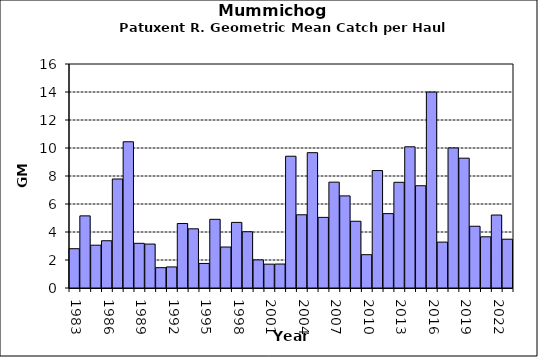
| Category | Series 0 |
|---|---|
| 1983.0 | 2.806 |
| 1984.0 | 5.153 |
| 1985.0 | 3.058 |
| 1986.0 | 3.375 |
| 1987.0 | 7.787 |
| 1988.0 | 10.445 |
| 1989.0 | 3.191 |
| 1990.0 | 3.139 |
| 1991.0 | 1.452 |
| 1992.0 | 1.505 |
| 1993.0 | 4.608 |
| 1994.0 | 4.228 |
| 1995.0 | 1.754 |
| 1996.0 | 4.906 |
| 1997.0 | 2.927 |
| 1998.0 | 4.686 |
| 1999.0 | 4.02 |
| 2000.0 | 2.009 |
| 2001.0 | 1.704 |
| 2002.0 | 1.712 |
| 2003.0 | 9.412 |
| 2004.0 | 5.23 |
| 2005.0 | 9.666 |
| 2006.0 | 5.044 |
| 2007.0 | 7.561 |
| 2008.0 | 6.58 |
| 2009.0 | 4.767 |
| 2010.0 | 2.38 |
| 2011.0 | 8.389 |
| 2012.0 | 5.313 |
| 2013.0 | 7.55 |
| 2014.0 | 10.086 |
| 2015.0 | 7.305 |
| 2016.0 | 13.995 |
| 2017.0 | 3.279 |
| 2018.0 | 10.004 |
| 2019.0 | 9.273 |
| 2020.0 | 4.41 |
| 2021.0 | 3.657 |
| 2022.0 | 5.213 |
| 2023.0 | 3.485 |